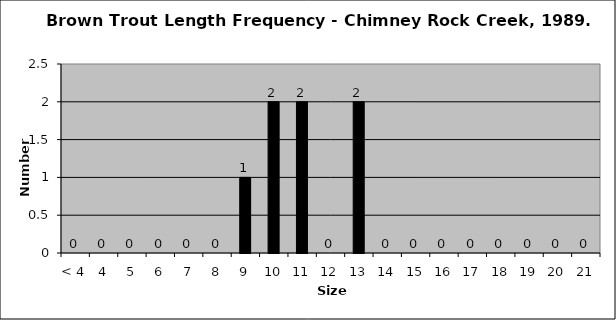
| Category | Series 0 |
|---|---|
| < 4 | 0 |
| 4 | 0 |
| 5 | 0 |
| 6 | 0 |
| 7 | 0 |
| 8 | 0 |
| 9 | 1 |
| 10 | 2 |
| 11 | 2 |
| 12 | 0 |
| 13 | 2 |
| 14 | 0 |
| 15 | 0 |
| 16 | 0 |
| 17 | 0 |
| 18 | 0 |
| 19 | 0 |
| 20 | 0 |
| 21 | 0 |